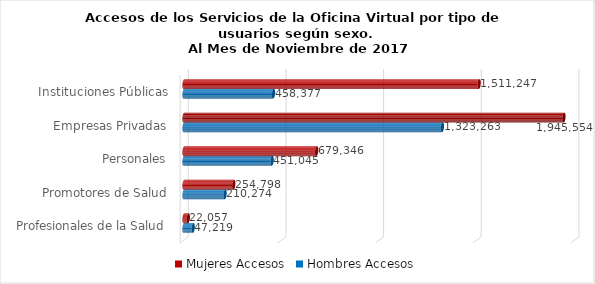
| Category | Mujeres | Hombres |
|---|---|---|
| Instituciones Públicas | 1511247 | 458377 |
| Empresas Privadas | 1945554 | 1323263 |
| Personales | 679346 | 451045 |
| Promotores de Salud | 254798 | 210274 |
| Profesionales de la Salud | 22057 | 47219 |